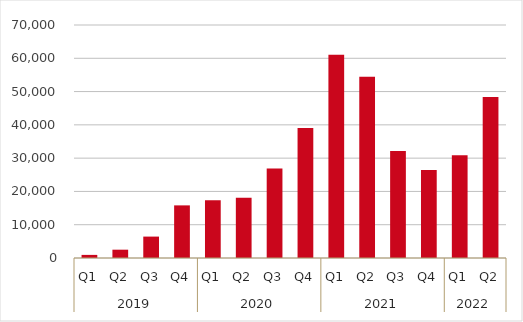
| Category | Series 0 |
|---|---|
| 0 | 932.158 |
| 1 | 2497.29 |
| 2 | 6430.386 |
| 3 | 15809.548 |
| 4 | 17347.321 |
| 5 | 18121.416 |
| 6 | 26914.841 |
| 7 | 39071.291 |
| 8 | 61075.901 |
| 9 | 54422.538 |
| 10 | 32150.696 |
| 11 | 26461.329 |
| 12 | 30831.874 |
| 13 | 48358.337 |